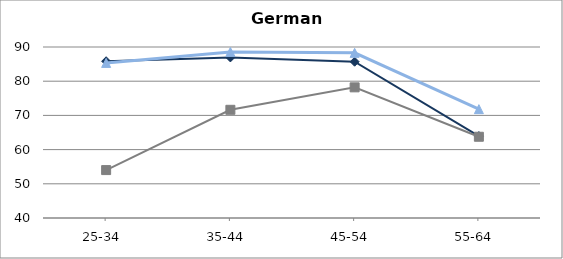
| Category | Work-study programmes | School-based programmes | General programmes |
|---|---|---|---|
| 25-34  | 85.834 | 85.349 | 54.012 |
| 35-44  | 86.952 | 88.568 | 71.636 |
| 45-54  | 85.695 | 88.294 | 78.2 |
| 55-64  | 63.949 | 71.827 | 63.753 |